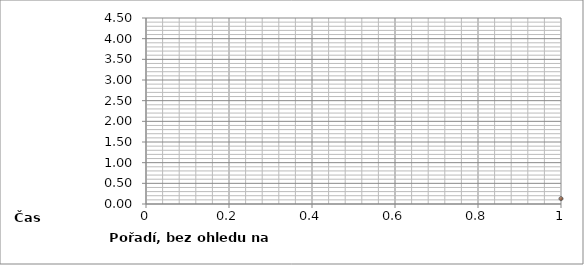
| Category | Series 0 |
|---|---|
| 0 | 0.13 |
| 1 | 0.13 |
| 2 | 0.16 |
| 3 | 0.17 |
| 4 | 0.19 |
| 5 | 0.19 |
| 6 | 0.27 |
| 7 | 0.27 |
| 8 | 0.4 |
| 9 | 0.54 |
| 10 | 0.56 |
| 11 | 0.58 |
| 12 | 0.61 |
| 13 | 0.69 |
| 14 | 0.69 |
| 15 | 0.78 |
| 16 | 0.87 |
| 17 | 0.9 |
| 18 | 0.98 |
| 19 | 1.12 |
| 20 | 1.17 |
| 21 | 1.23 |
| 22 | 1.29 |
| 23 | 1.31 |
| 24 | 1.36 |
| 25 | 1.71 |
| 26 | 1.76 |
| 27 | 1.79 |
| 28 | 1.82 |
| 29 | 1.89 |
| 30 | 1.91 |
| 31 | 1.95 |
| 32 | 2.18 |
| 33 | 2.24 |
| 34 | 2.46 |
| 35 | 2.52 |
| 36 | 2.57 |
| 37 | 2.62 |
| 38 | 2.66 |
| 39 | 2.77 |
| 40 | 2.79 |
| 41 | 3.22 |
| 42 | 3.27 |
| 43 | 3.27 |
| 44 | 3.28 |
| 45 | 3.28 |
| 46 | 3.29 |
| 47 | 3.3 |
| 48 | 3.48 |
| 49 | 3.49 |
| 50 | 3.51 |
| 51 | 3.51 |
| 52 | 3.63 |
| 53 | 3.65 |
| 54 | 3.83 |
| 55 | 3.89 |
| 56 | 3.91 |
| 57 | 3.94 |
| 58 | 3.95 |
| 59 | 3.98 |
| 60 | 4.03 |
| 61 | 4.06 |
| 62 | 4.28 |